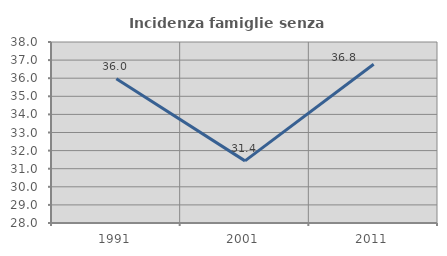
| Category | Incidenza famiglie senza nuclei |
|---|---|
| 1991.0 | 35.97 |
| 2001.0 | 31.432 |
| 2011.0 | 36.771 |